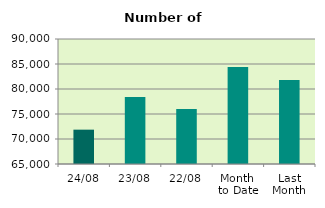
| Category | Series 0 |
|---|---|
| 24/08 | 71868 |
| 23/08 | 78394 |
| 22/08 | 76010 |
| Month 
to Date | 84397.889 |
| Last
Month | 81818 |